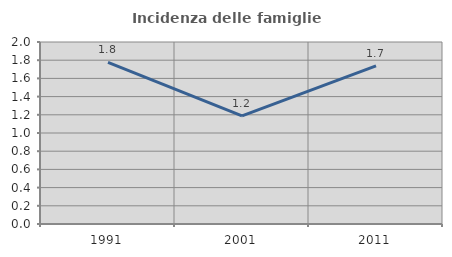
| Category | Incidenza delle famiglie numerose |
|---|---|
| 1991.0 | 1.775 |
| 2001.0 | 1.188 |
| 2011.0 | 1.737 |